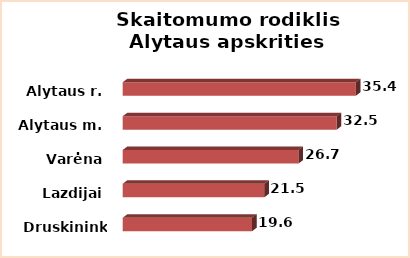
| Category | Series 0 |
|---|---|
| Druskininkai | 19.64 |
| Lazdijai | 21.5 |
| Varėna | 26.7 |
| Alytaus m. | 32.5 |
| Alytaus r. | 35.4 |